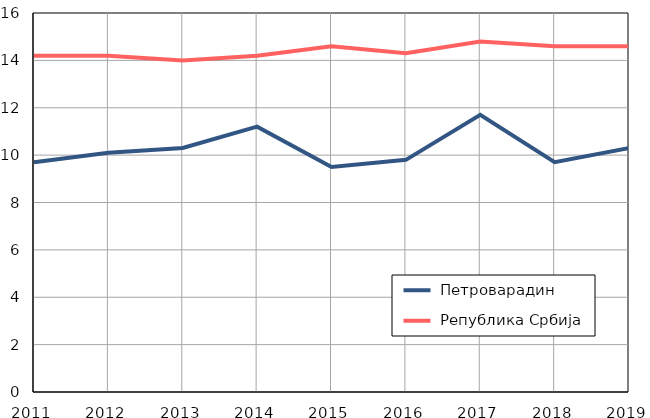
| Category |  Петроварадин |  Република Србија |
|---|---|---|
| 2011.0 | 9.7 | 14.2 |
| 2012.0 | 10.1 | 14.2 |
| 2013.0 | 10.3 | 14 |
| 2014.0 | 11.2 | 14.2 |
| 2015.0 | 9.5 | 14.6 |
| 2016.0 | 9.8 | 14.3 |
| 2017.0 | 11.7 | 14.8 |
| 2018.0 | 9.7 | 14.6 |
| 2019.0 | 10.3 | 14.6 |